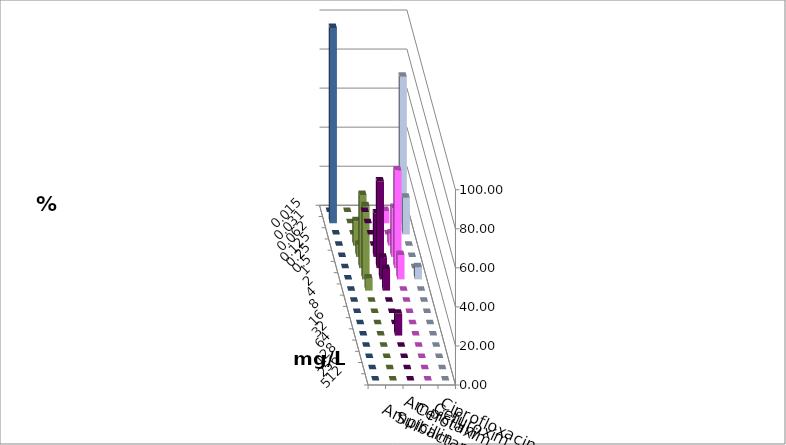
| Category | Ampicillin | Ampicillin/ Sulbactam | Cefotaxim | Cefuroxim | Ciprofloxacin |
|---|---|---|---|---|---|
| 0.015 | 0 | 0 | 0 | 0 | 0 |
| 0.031 | 0 | 6.25 | 75 | 0 | 100 |
| 0.062 | 0 | 0 | 18.75 | 0 | 0 |
| 0.125 | 0 | 6.25 | 0 | 12.5 | 0 |
| 0.25 | 22.222 | 25 | 0 | 6.25 | 0 |
| 0.5 | 44.444 | 50 | 0 | 37.5 | 0 |
| 1.0 | 11.111 | 12.5 | 6.25 | 37.5 | 0 |
| 2.0 | 11.111 | 0 | 0 | 6.25 | 0 |
| 4.0 | 0 | 0 | 0 | 0 | 0 |
| 8.0 | 0 | 0 | 0 | 0 | 0 |
| 16.0 | 0 | 0 | 0 | 0 | 0 |
| 32.0 | 11.111 | 0 | 0 | 0 | 0 |
| 64.0 | 0 | 0 | 0 | 0 | 0 |
| 128.0 | 0 | 0 | 0 | 0 | 0 |
| 256.0 | 0 | 0 | 0 | 0 | 0 |
| 512.0 | 0 | 0 | 0 | 0 | 0 |